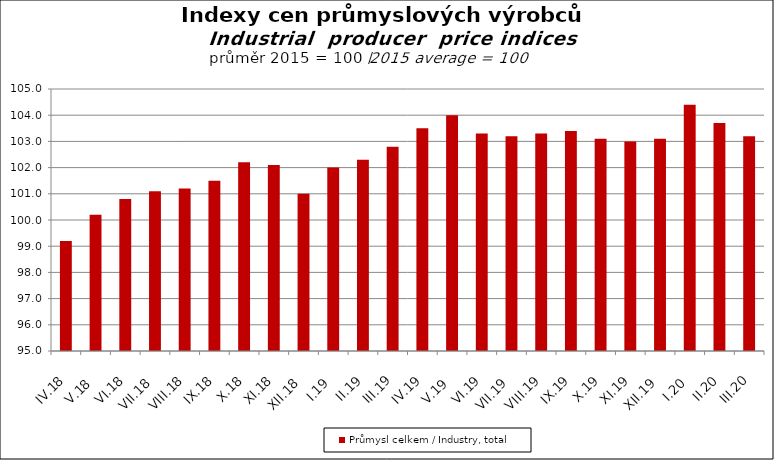
| Category | Průmysl celkem / Industry, total |
|---|---|
| IV.18 | 99.2 |
| V.18 | 100.2 |
| VI.18 | 100.8 |
| VII.18 | 101.1 |
| VIII.18 | 101.2 |
| IX.18 | 101.5 |
| X.18 | 102.2 |
| XI.18 | 102.1 |
| XII.18 | 101 |
| I.19 | 102 |
| II.19 | 102.3 |
| III.19 | 102.8 |
| IV.19 | 103.5 |
| V.19 | 104 |
| VI.19 | 103.3 |
| VII.19 | 103.2 |
| VIII.19 | 103.3 |
| IX.19 | 103.4 |
| X.19 | 103.1 |
| XI.19 | 103 |
| XII.19 | 103.1 |
| I.20 | 104.4 |
| II.20 | 103.7 |
| III.20 | 103.2 |